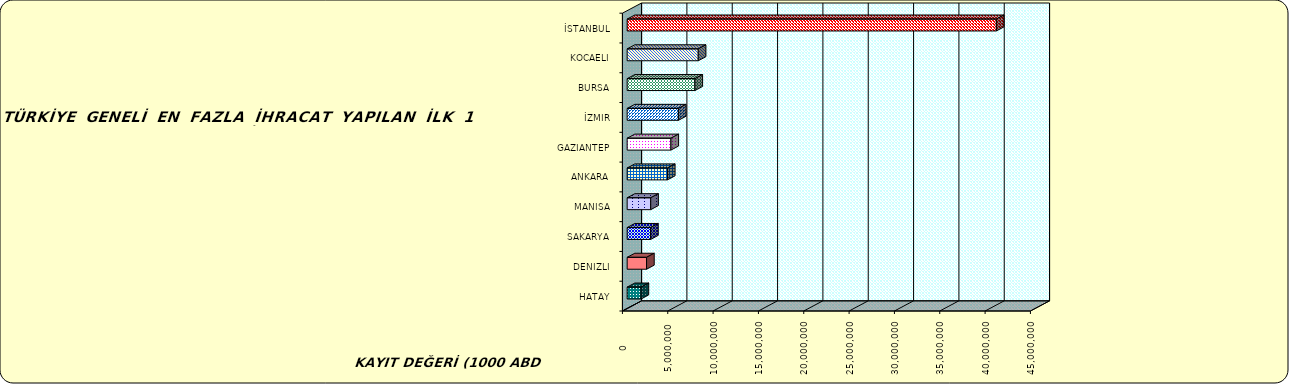
| Category | Series 0 |
|---|---|
| İSTANBUL | 40715379.848 |
| KOCAELI | 7840382.923 |
| BURSA | 7473073.812 |
| İZMIR | 5651308.367 |
| GAZIANTEP | 4825290.802 |
| ANKARA | 4441806.066 |
| MANISA | 2597220.604 |
| SAKARYA | 2583958.467 |
| DENIZLI | 2138604.554 |
| HATAY | 1531571.327 |